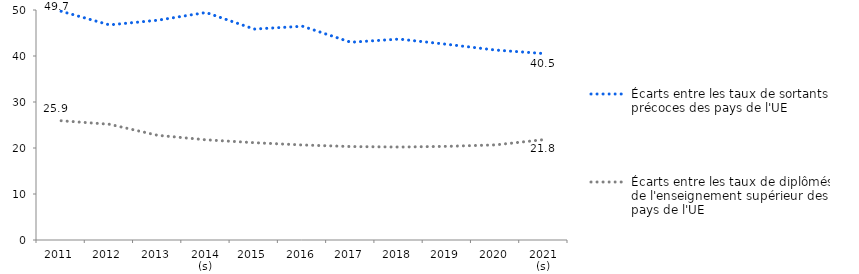
| Category | Écarts entre les taux de sortants précoces des pays de l'UE | Écarts entre les taux de diplômés de l'enseignement supérieur des pays de l'UE |
|---|---|---|
| 2011 | 49.724 | 25.924 |
| 2012 | 46.764 | 25.16 |
| 2013 | 47.776 | 22.756 |
| 2014 (s) | 49.453 | 21.783 |
| 2015 | 45.855 | 21.151 |
| 2016 | 46.469 | 20.657 |
| 2017 | 42.992 | 20.315 |
| 2018 | 43.677 | 20.209 |
| 2019 | 42.537 | 20.359 |
| 2020 | 41.293 | 20.678 |
| 2021 (s) | 40.533 | 21.82 |